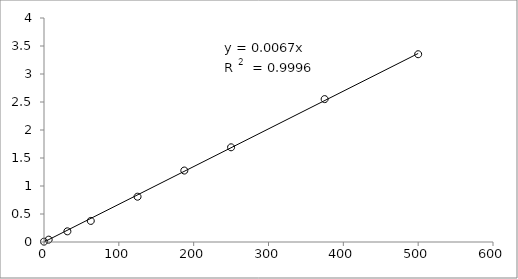
| Category | Series 0 |
|---|---|
| 500.0 | 3.353 |
| 375.0 | 2.552 |
| 250.0 | 1.691 |
| 187.5 | 1.276 |
| 125.0 | 0.809 |
| 62.5 | 0.376 |
| 31.25 | 0.19 |
| 6.25 | 0.042 |
| 0.0 | 0.007 |